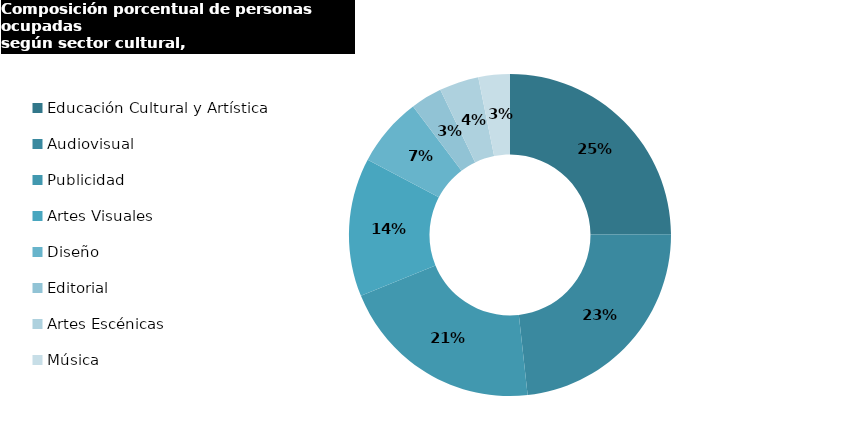
| Category | Series 0 |
|---|---|
| Educación Cultural y Artística | 11286.337 |
| Audiovisual | 10571.502 |
| Publicidad | 9325.823 |
| Artes Visuales | 6297.688 |
| Diseño | 3160 |
| Editorial | 1431 |
| Artes Escénicas | 1795.66 |
| Música | 1431 |